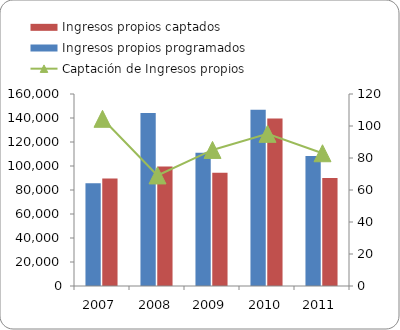
| Category | Ingresos propios programados | Ingresos propios captados  |
|---|---|---|
| 2007 | 85720 | 89571 |
| 2008 | 144091 | 99570 |
| 2009 | 111000 | 94407 |
| 2010 | 146775 | 139593 |
| 2011 | 108380 | 89927 |